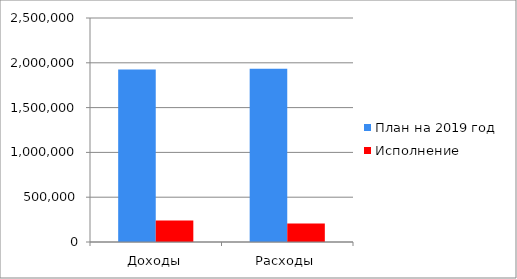
| Category | План на 2019 год | Исполнение |
|---|---|---|
| Доходы | 1924744 | 239628 |
| Расходы | 1932744 | 206829 |